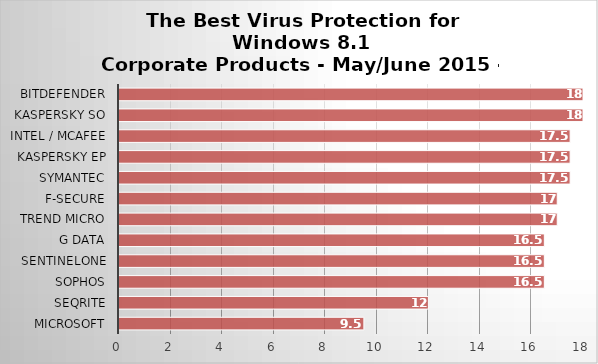
| Category | Series 0 |
|---|---|
| Microsoft | 9.5 |
| Seqrite | 12 |
| Sophos | 16.5 |
| SentinelOne | 16.5 |
| G Data | 16.5 |
| Trend Micro | 17 |
| F-Secure | 17 |
| Symantec | 17.5 |
| Kaspersky EP | 17.5 |
| Intel / McAfee | 17.5 |
| Kaspersky SO | 18 |
| Bitdefender | 18 |